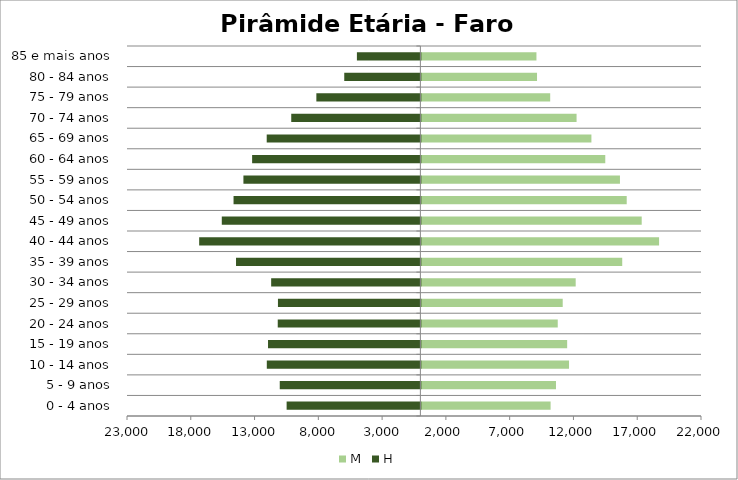
| Category | M | H |
|---|---|---|
| 0 - 4 anos | 10131 | -10486 |
| 5 - 9 anos | 10553 | -11025 |
| 10 - 14 anos | 11575 | -12040 |
| 15 - 19 anos | 11429 | -11945 |
| 20 - 24 anos | 10691 | -11182 |
| 25 - 29 anos | 11080 | -11166 |
| 30 - 34 anos | 12098 | -11698 |
| 35 - 39 anos | 15746 | -14453 |
| 40 - 44 anos | 18635 | -17342 |
| 45 - 49 anos | 17273 | -15569 |
| 50 - 54 anos | 16098 | -14647 |
| 55 - 59 anos | 15568 | -13873 |
| 60 - 64 anos | 14417 | -13191 |
| 65 - 69 anos | 13330 | -12047 |
| 70 - 74 anos | 12167 | -10124 |
| 75 - 79 anos | 10099 | -8155 |
| 80 - 84 anos | 9066 | -5968 |
| 85 e mais anos | 9021 | -4976 |